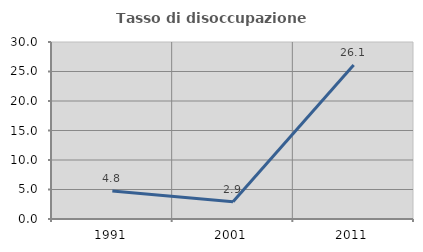
| Category | Tasso di disoccupazione giovanile  |
|---|---|
| 1991.0 | 4.762 |
| 2001.0 | 2.941 |
| 2011.0 | 26.087 |